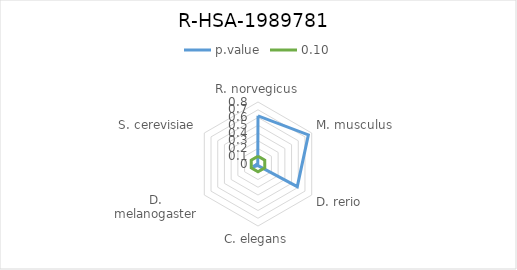
| Category | p.value | 0.10 |
|---|---|---|
| R. norvegicus | 0.622 | 0.1 |
| M. musculus | 0.75 | 0.1 |
| D. rerio | 0.585 | 0.1 |
| C. elegans | 0.02 | 0.1 |
| D. melanogaster | 0.075 | 0.1 |
| S. cerevisiae | 0.004 | 0.1 |